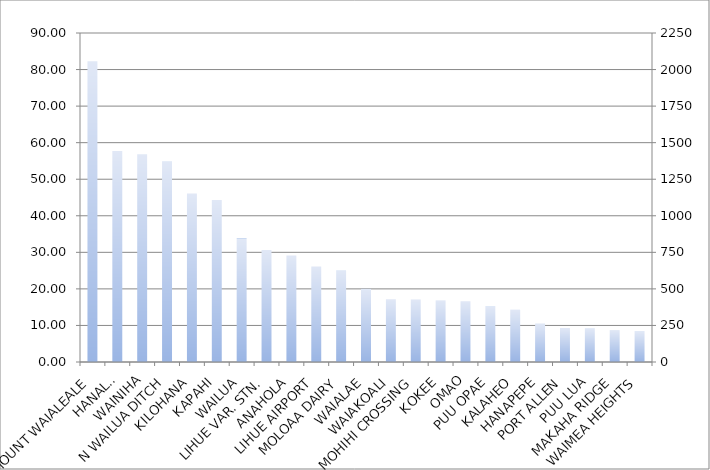
| Category | inches |
|---|---|
| MOUNT WAIALEALE | 82.24 |
| HANALEI | 57.71 |
| WAINIHA | 56.86 |
| N WAILUA DITCH | 54.8 |
| KILOHANA | 46.11 |
| KAPAHI | 44.31 |
| WAILUA | 33.77 |
| LIHUE VAR. STN. | 30.67 |
| ANAHOLA | 29.16 |
| LIHUE AIRPORT | 26.14 |
| MOLOAA DAIRY | 24.94 |
| WAIALAE | 20 |
| WAIAKOALI | 17.17 |
| MOHIHI CROSSING | 17.12 |
| KOKEE | 16.87 |
| OMAO | 16.62 |
| PUU OPAE | 15.13 |
| KALAHEO | 14.26 |
| HANAPEPE | 10.54 |
| PORT ALLEN | 9.3 |
| PUU LUA | 9.1 |
| MAKAHA RIDGE | 8.73 |
| WAIMEA HEIGHTS | 8.29 |